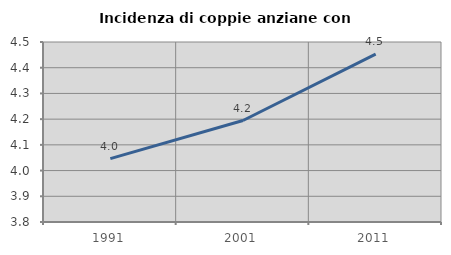
| Category | Incidenza di coppie anziane con figli |
|---|---|
| 1991.0 | 4.046 |
| 2001.0 | 4.195 |
| 2011.0 | 4.453 |